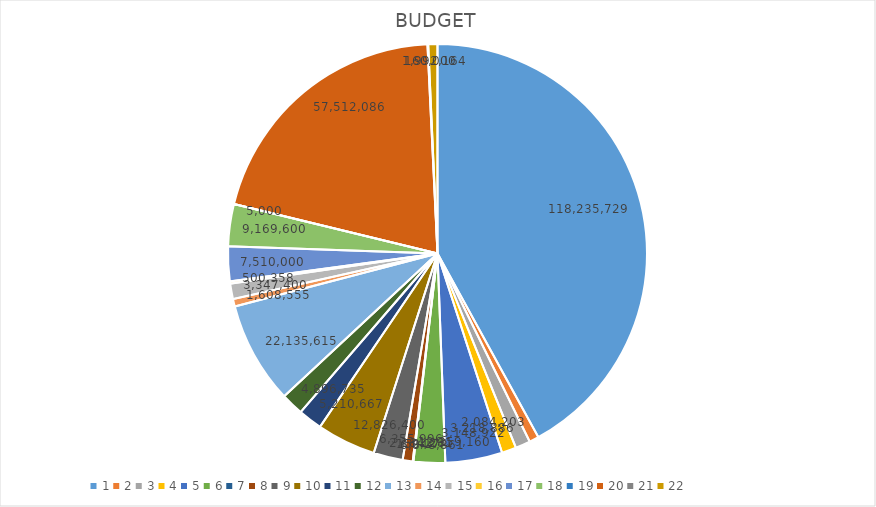
| Category |  BUDGET  |
|---|---|
| 0 | 118235729 |
| 1 | 2084203 |
| 2 | 3218886 |
| 3 | 3148922 |
| 4 | 12359160 |
| 5 | 6848861 |
| 6 | 150174 |
| 7 | 2184281 |
| 8 | 6355996 |
| 9 | 12826400 |
| 10 | 5210667 |
| 11 | 4896735 |
| 12 | 22135615 |
| 13 | 1608555 |
| 14 | 3347400 |
| 15 | 500358 |
| 16 | 7510000 |
| 17 | 9169600 |
| 18 | 5000 |
| 19 | 57512086 |
| 20 | 160000 |
| 21 | 1992164 |